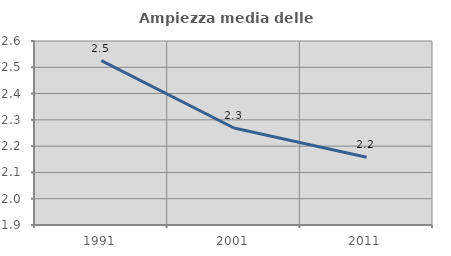
| Category | Ampiezza media delle famiglie |
|---|---|
| 1991.0 | 2.525 |
| 2001.0 | 2.269 |
| 2011.0 | 2.158 |